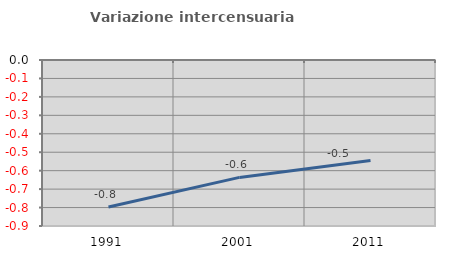
| Category | Variazione intercensuaria annua |
|---|---|
| 1991.0 | -0.797 |
| 2001.0 | -0.636 |
| 2011.0 | -0.544 |